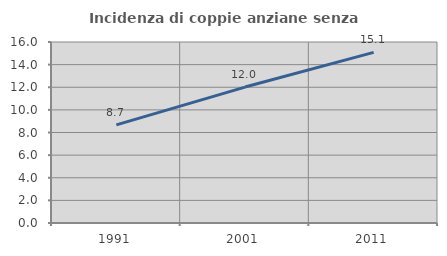
| Category | Incidenza di coppie anziane senza figli  |
|---|---|
| 1991.0 | 8.677 |
| 2001.0 | 12.016 |
| 2011.0 | 15.079 |